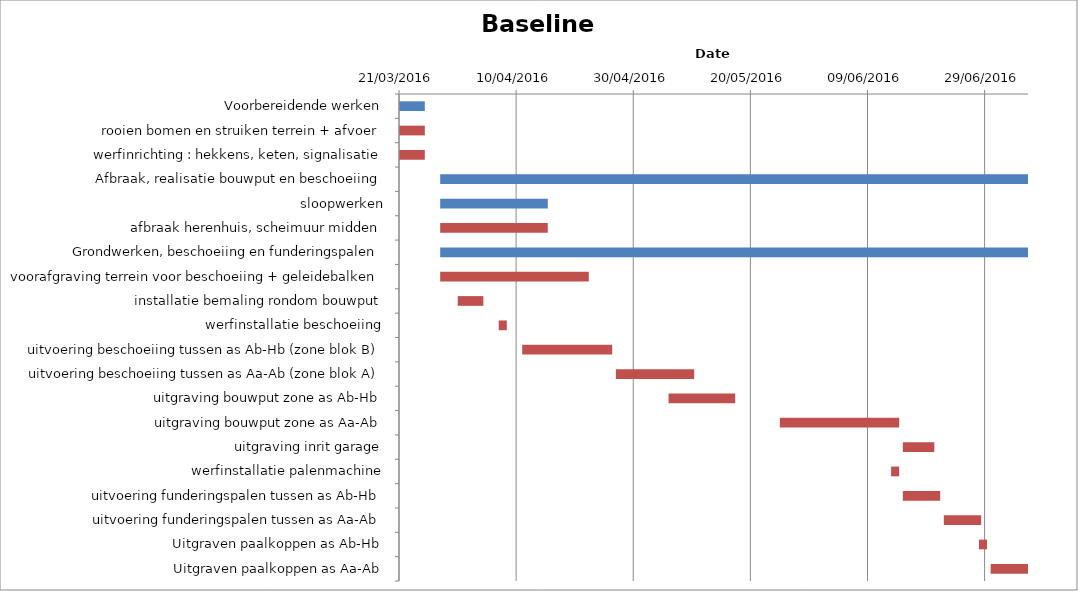
| Category | Baseline start | Actual duration |
|---|---|---|
| Voorbereidende werken | 42450.333 | 4.375 |
| rooien bomen en struiken terrein + afvoer | 42450.333 | 4.375 |
| werfinrichting : hekkens, keten, signalisatie | 42450.333 | 4.375 |
| Afbraak, realisatie bouwput en beschoeiing | 42457.333 | 100.375 |
| sloopwerken | 42457.333 | 18.375 |
| afbraak herenhuis, scheimuur midden | 42457.333 | 18.375 |
| Grondwerken, beschoeiing en funderingspalen | 42457.333 | 100.375 |
| voorafgraving terrein voor beschoeiing + geleidebalken | 42457.333 | 25.375 |
| installatie bemaling rondom bouwput | 42460.333 | 4.375 |
| werfinstallatie beschoeiing | 42467.333 | 1.375 |
| uitvoering beschoeiing tussen as Ab-Hb (zone blok B) | 42471.333 | 15.375 |
| uitvoering beschoeiing tussen as Aa-Ab (zone blok A) | 42487.333 | 13.375 |
| uitgraving bouwput zone as Ab-Hb | 42496.333 | 11.375 |
| uitgraving bouwput zone as Aa-Ab | 42515.333 | 20.375 |
| uitgraving inrit garage | 42536.333 | 5.375 |
| werfinstallatie palenmachine | 42534.333 | 1.375 |
| uitvoering funderingspalen tussen as Ab-Hb | 42536.333 | 6.375 |
| uitvoering funderingspalen tussen as Aa-Ab | 42543.333 | 6.375 |
| Uitgraven paalkoppen as Ab-Hb | 42549.333 | 1.375 |
| Uitgraven paalkoppen as Aa-Ab | 42551.333 | 6.375 |